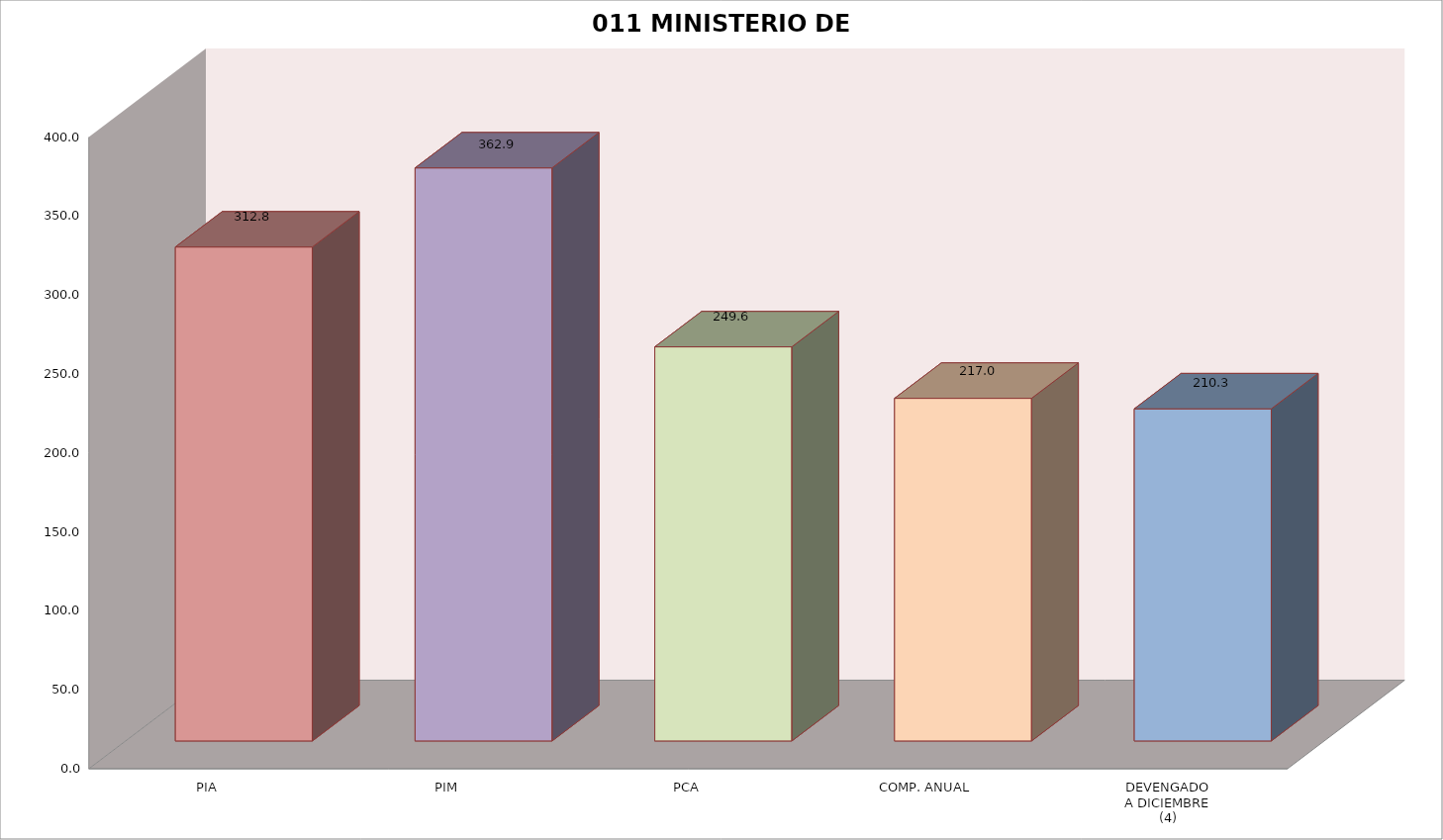
| Category | 011 MINISTERIO DE SALUD |
|---|---|
| PIA | 312.801 |
| PIM | 362.893 |
| PCA | 249.576 |
| COMP. ANUAL | 216.987 |
| DEVENGADO
A DICIEMBRE
(4) | 210.326 |